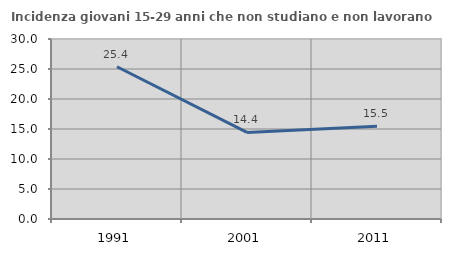
| Category | Incidenza giovani 15-29 anni che non studiano e non lavorano  |
|---|---|
| 1991.0 | 25.373 |
| 2001.0 | 14.436 |
| 2011.0 | 15.468 |